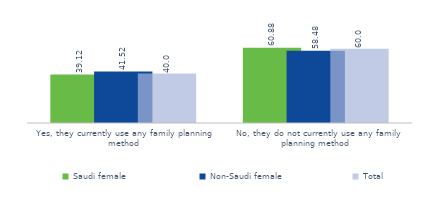
| Category | Saudi female  | Non-Saudi female | Total |
|---|---|---|---|
| Yes, they currently use any family planning method | 39.124 | 41.521 | 39.992 |
|  No, they do not currently use any family planning method | 60.876 | 58.479 | 60.008 |